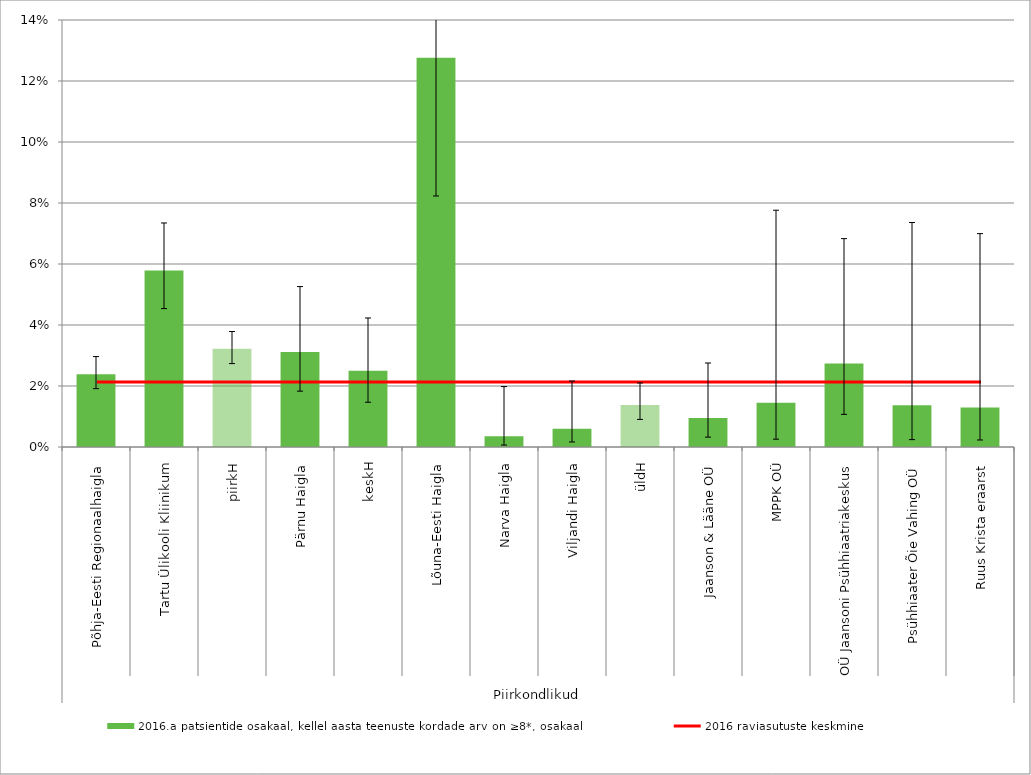
| Category | 2016.a patsientide osakaal, kellel aasta teenuste kordade arv on ≥8*, osakaal |
|---|---|
| 0 | 0.024 |
| 1 | 0.058 |
| 2 | 0.032 |
| 3 | 0.031 |
| 4 | 0.025 |
| 5 | 0.128 |
| 6 | 0.004 |
| 7 | 0.006 |
| 8 | 0.014 |
| 9 | 0.009 |
| 10 | 0.014 |
| 11 | 0.027 |
| 12 | 0.014 |
| 13 | 0.013 |